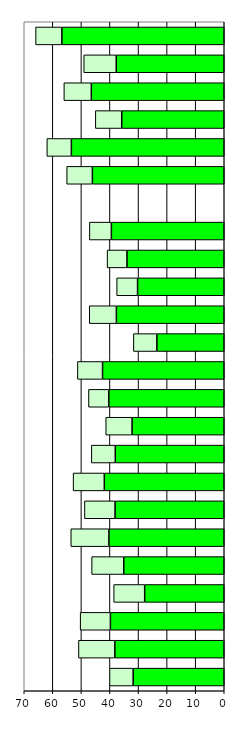
| Category | Series 0 | Series 1 |
|---|---|---|
| 0 | 31.882 | 8.278 |
| 1 | 38.296 | 12.731 |
| 2 | 39.845 | 10.584 |
| 3 | 27.848 | 10.85 |
| 4 | 35.175 | 11.24 |
| 5 | 40.369 | 13.341 |
| 6 | 38.22 | 10.711 |
| 7 | 41.977 | 10.918 |
| 8 | 38.135 | 8.386 |
| 9 | 32.264 | 9.218 |
| 10 | 40.398 | 7.116 |
| 11 | 42.589 | 8.806 |
| 12 | 23.581 | 8.22 |
| 13 | 37.757 | 9.488 |
| 14 | 30.343 | 7.313 |
| 15 | 34.046 | 6.953 |
| 16 | 39.498 | 7.7 |
| 17 | 0 | 0 |
| 18 | 46.154 | 8.994 |
| 19 | 53.505 | 8.585 |
| 20 | 35.88 | 9.242 |
| 21 | 46.523 | 9.61 |
| 22 | 37.799 | 11.383 |
| 23 | 56.827 | 9.206 |